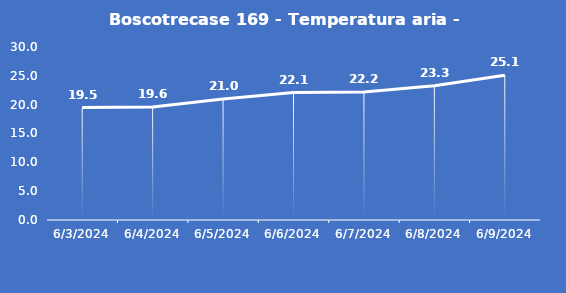
| Category | Boscotrecase 169 - Temperatura aria - Grezzo (°C) |
|---|---|
| 6/3/24 | 19.5 |
| 6/4/24 | 19.6 |
| 6/5/24 | 21 |
| 6/6/24 | 22.1 |
| 6/7/24 | 22.2 |
| 6/8/24 | 23.3 |
| 6/9/24 | 25.1 |